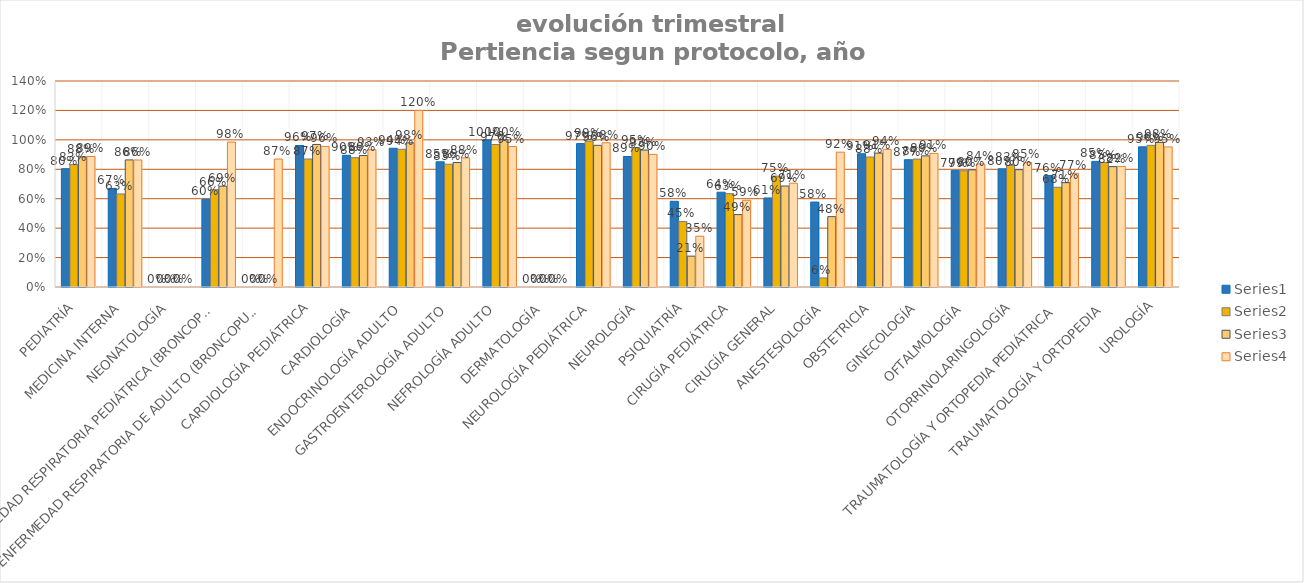
| Category | Series 0 | Series 1 | Series 2 | Series 3 |
|---|---|---|---|---|
| PEDIATRÍA | 0.804 | 0.832 | 0.884 | 0.887 |
| MEDICINA INTERNA | 0.67 | 0.632 | 0.864 | 0.863 |
| NEONATOLOGÍA | 0 | 0 | 0 | 0 |
| ENFERMEDAD RESPIRATORIA PEDIÁTRICA (BRONCOPULMONAR INFANTIL) | 0.596 | 0.662 | 0.685 | 0.985 |
| ENFERMEDAD RESPIRATORIA DE ADULTO (BRONCOPULMONAR) | 0 | 0 | 0 | 0.87 |
| CARDIOLOGÍA PEDIÁTRICA | 0.962 | 0.87 | 0.969 | 0.956 |
| CARDIOLOGÍA  | 0.895 | 0.879 | 0.894 | 0.933 |
| ENDOCRINOLOGÍA ADULTO | 0.943 | 0.936 | 0.98 | 1.2 |
| GASTROENTEROLOGÍA ADULTO | 0.851 | 0.834 | 0.846 | 0.877 |
| NEFROLOGÍA ADULTO | 1 | 0.968 | 1 | 0.955 |
| DERMATOLOGÍA | 0 | 0 | 0 | 0 |
| NEUROLOGÍA PEDIÁTRICA | 0.975 | 0.99 | 0.963 | 0.98 |
| NEUROLOGÍA | 0.887 | 0.948 | 0.931 | 0.901 |
| PSIQUIATRÍA | 0.582 | 0.445 | 0.21 | 0.345 |
| CIRUGÍA PEDIÁTRICA | 0.644 | 0.634 | 0.492 | 0.589 |
| CIRUGÍA GENERAL | 0.605 | 0.754 | 0.686 | 0.705 |
| ANESTESIOLOGÍA | 0.577 | 0.062 | 0.478 | 0.916 |
| OBSTETRICIA | 0.906 | 0.883 | 0.91 | 0.936 |
| GINECOLOGÍA | 0.865 | 0.87 | 0.891 | 0.908 |
| OFTALMOLOGÍA | 0.791 | 0.79 | 0.796 | 0.837 |
| OTORRINOLARINGOLOGÍA | 0.803 | 0.827 | 0.798 | 0.847 |
| TRAUMATOLOGÍA Y ORTOPEDIA PEDIÁTRICA | 0.757 | 0.678 | 0.709 | 0.773 |
| TRAUMATOLOGÍA Y ORTOPEDIA | 0.854 | 0.846 | 0.818 | 0.82 |
| UROLOGÍA | 0.953 | 0.963 | 0.983 | 0.952 |